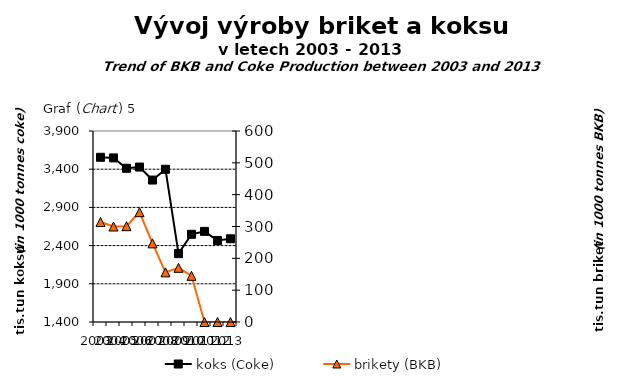
| Category | koks (Coke) |
|---|---|
| 2003.0 | 3556 |
| 2004.0 | 3548 |
| 2005.0 | 3412 |
| 2006.0 | 3428 |
| 2007.0 | 3258 |
| 2008.0 | 3399 |
| 2009.0 | 2294.799 |
| 2010.0 | 2548 |
| 2011.0 | 2586 |
| 2012.0 | 2466.636 |
| 2013.0 | 2489.372 |